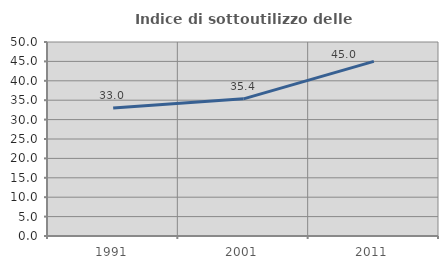
| Category | Indice di sottoutilizzo delle abitazioni  |
|---|---|
| 1991.0 | 32.99 |
| 2001.0 | 35.354 |
| 2011.0 | 45 |